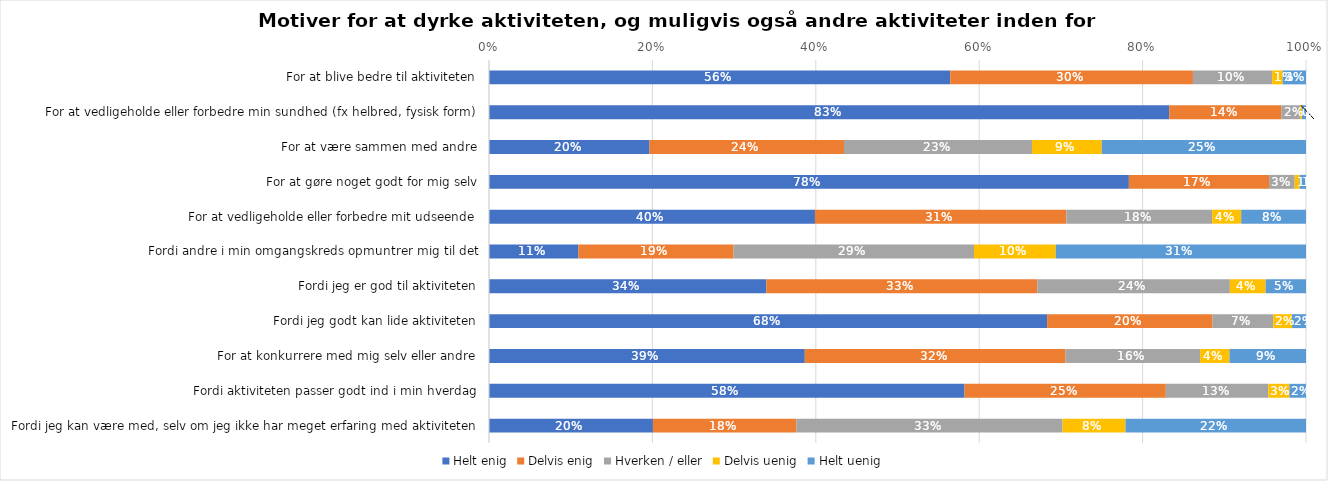
| Category | Helt enig | Delvis enig | Hverken / eller | Delvis uenig | Helt uenig |
|---|---|---|---|---|---|
| For at blive bedre til aktiviteten | 0.565 | 0.297 | 0.097 | 0.013 | 0.029 |
| For at vedligeholde eller forbedre min sundhed (fx helbred, fysisk form) | 0.833 | 0.137 | 0.023 | 0.002 | 0.005 |
| For at være sammen med andre | 0.196 | 0.238 | 0.23 | 0.085 | 0.25 |
| For at gøre noget godt for mig selv | 0.783 | 0.172 | 0.031 | 0.006 | 0.008 |
| For at vedligeholde eller forbedre mit udseende | 0.399 | 0.308 | 0.179 | 0.036 | 0.079 |
| Fordi andre i min omgangskreds opmuntrer mig til det | 0.109 | 0.19 | 0.294 | 0.1 | 0.306 |
| Fordi jeg er god til aktiviteten | 0.339 | 0.332 | 0.236 | 0.044 | 0.049 |
| Fordi jeg godt kan lide aktiviteten | 0.683 | 0.202 | 0.074 | 0.023 | 0.017 |
| For at konkurrere med mig selv eller andre | 0.387 | 0.319 | 0.165 | 0.036 | 0.094 |
| Fordi aktiviteten passer godt ind i min hverdag | 0.582 | 0.246 | 0.125 | 0.026 | 0.02 |
| Fordi jeg kan være med, selv om jeg ikke har meget erfaring med aktiviteten | 0.201 | 0.176 | 0.326 | 0.077 | 0.221 |